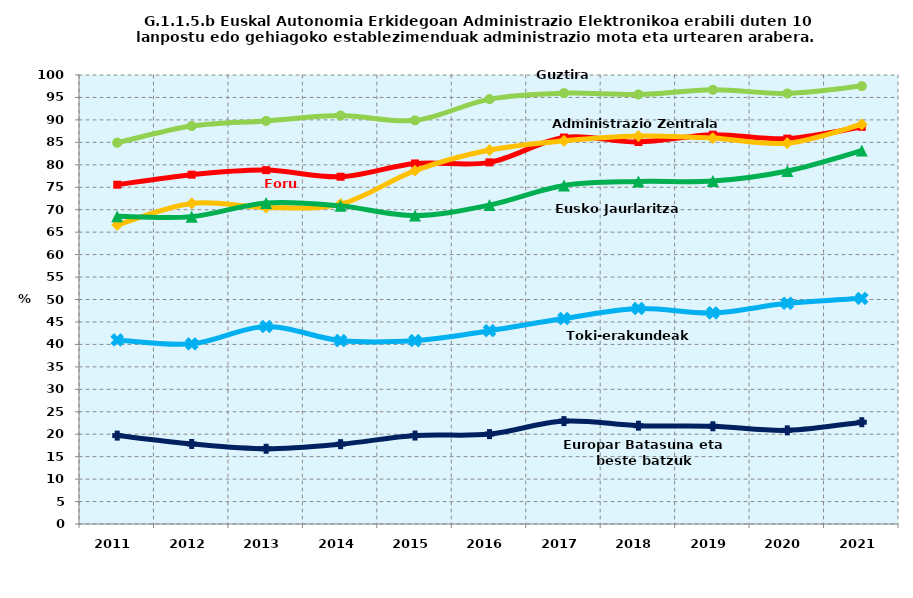
| Category | Guztira | Foru aldundiak | Administrazio Zentrala | Eusko Jaurlaritza | Toki-erakundeak | Europar Batasuna eta beste batzuk |
|---|---|---|---|---|---|---|
| 2011.0 | 84.919 | 75.566 | 66.635 | 68.518 | 40.99 | 19.69 |
| 2012.0 | 88.639 | 77.803 | 71.399 | 68.457 | 40.12 | 17.825 |
| 2013.0 | 89.774 | 78.814 | 70.5 | 71.513 | 43.99 | 16.752 |
| 2014.0 | 90.972 | 77.343 | 71.245 | 70.852 | 40.845 | 17.779 |
| 2015.0 | 89.9 | 80.3 | 78.7 | 68.7 | 40.845 | 19.7 |
| 2016.0 | 94.63 | 80.543 | 83.285 | 71.025 | 43.062 | 20.023 |
| 2017.0 | 95.964 | 86.074 | 85.341 | 75.396 | 45.758 | 22.918 |
| 2018.0 | 95.655 | 85.076 | 86.41 | 76.28 | 48.003 | 21.89 |
| 2019.0 | 96.71 | 86.706 | 85.942 | 76.372 | 47.022 | 21.763 |
| 2020.0 | 95.9 | 85.833 | 84.824 | 78.619 | 49.153 | 20.862 |
| 2021.0 | 97.529 | 88.456 | 89.021 | 83.165 | 50.257 | 22.668 |